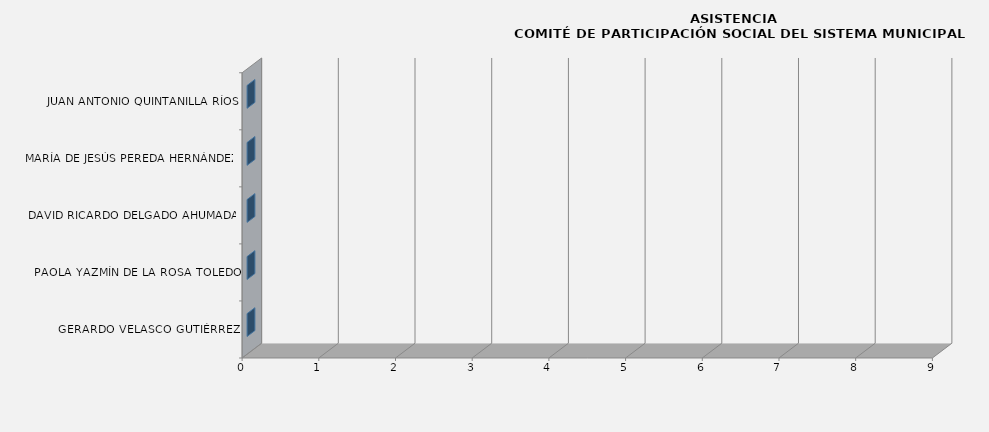
| Category | Series 0 |
|---|---|
| GERARDO VELASCO GUTIÉRREZ | 0 |
| PAOLA YAZMÍN DE LA ROSA TOLEDO | 0 |
| DAVID RICARDO DELGADO AHUMADA | 0 |
| MARÍA DE JESÚS PEREDA HERNÁNDEZ | 0 |
| JUAN ANTONIO QUINTANILLA RÍOS | 0 |